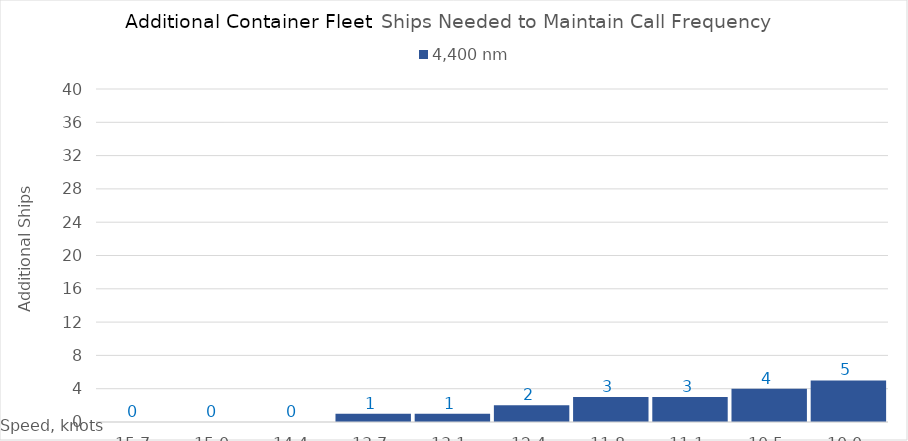
| Category | 4,400 |
|---|---|
| 15.65 | 0 |
| 15.0 | 0 |
| 14.35 | 0 |
| 13.7 | 1 |
| 13.049999999999999 | 1 |
| 12.399999999999999 | 2 |
| 11.749999999999998 | 3 |
| 11.099999999999998 | 3 |
| 10.449999999999998 | 4 |
| 10.0 | 5 |